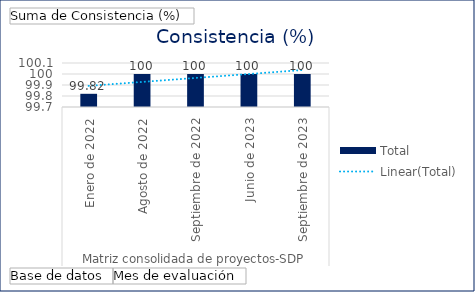
| Category | Total |
|---|---|
| 0 | 99.82 |
| 1 | 100 |
| 2 | 100 |
| 3 | 100 |
| 4 | 100 |